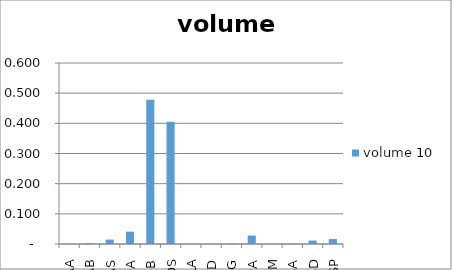
| Category |  volume 10  |
|---|---|
| AA | 0 |
| AB | 0.003 |
| AS | 0.015 |
| DA | 0.041 |
| DB | 0.478 |
| DS | 0.406 |
| LA | 0 |
| LD | 0 |
| LG | 0.001 |
| PA | 0.028 |
| RM | 0 |
| SA | 0.001 |
| SD | 0.011 |
| SP | 0.016 |